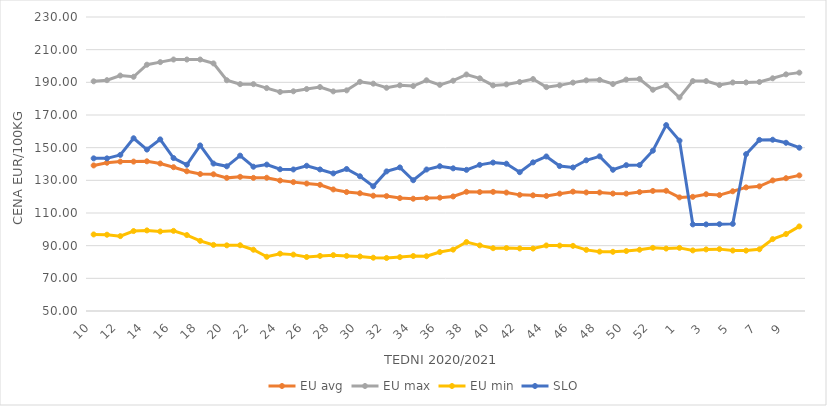
| Category | EU avg | EU max | EU min | SLO |
|---|---|---|---|---|
| 10.0 | 139.118 | 190.63 | 96.874 | 143.45 |
| 11.0 | 140.789 | 191.32 | 96.705 | 143.45 |
| 12.0 | 141.467 | 194.15 | 95.845 | 145.57 |
| 13.0 | 141.466 | 193.4 | 98.945 | 155.76 |
| 14.0 | 141.645 | 200.79 | 99.347 | 148.84 |
| 15.0 | 140.306 | 202.38 | 98.696 | 155.07 |
| 16.0 | 138.046 | 203.97 | 99.065 | 143.65 |
| 17.0 | 135.556 | 203.97 | 96.499 | 139.55 |
| 18.0 | 133.857 | 203.97 | 92.931 | 151.36 |
| 19.0 | 133.702 | 201.59 | 90.48 | 140.27 |
| 20.0 | 131.51 | 191.27 | 90.199 | 138.59 |
| 21.0 | 132.157 | 188.89 | 90.255 | 145.12 |
| 22.0 | 131.509 | 188.89 | 87.513 | 138.33 |
| 23.0 | 131.578 | 186.47 | 83.199 | 139.64 |
| 24.0 | 129.861 | 184.13 | 85.09 | 136.79 |
| 25.0 | 128.899 | 184.51 | 84.52 | 136.65 |
| 26.0 | 128.034 | 185.91 | 83.06 | 138.92 |
| 27.0 | 127.242 | 187.11 | 83.73 | 136.67 |
| 28.0 | 124.426 | 184.46 | 84.2 | 134.25 |
| 29.0 | 122.822 | 185.09 | 83.72 | 136.94 |
| 30.0 | 122.086 | 190.31 | 83.4 | 132.48 |
| 31.0 | 120.581 | 189.19 | 82.63 | 126.34 |
| 32.0 | 120.341 | 186.67 | 82.46 | 135.48 |
| 33.0 | 119.127 | 188.18 | 82.99 | 137.89 |
| 34.0 | 118.75 | 187.74 | 83.66 | 130.07 |
| 35.0 | 119.136 | 191.25 | 83.53 | 136.63 |
| 36.0 | 119.398 | 188.47 | 86.09 | 138.64 |
| 37.0 | 120.135 | 190.99 | 87.57 | 137.35 |
| 38.0 | 122.982 | 194.8 | 92.21 | 136.42 |
| 39.0 | 122.832 | 192.45 | 90.16 | 139.46 |
| 40.0 | 122.936 | 188.11 | 88.45 | 140.87 |
| 41.0 | 122.507 | 188.73 | 88.54 | 140.18 |
| 42.0 | 121.098 | 190.2 | 88.3 | 134.98 |
| 43.0 | 120.822 | 191.99 | 88.22 | 141 |
| 44.0 | 120.448 | 187.06 | 90.13 | 144.61 |
| 45.0 | 121.843 | 188.15 | 90.04 | 138.73 |
| 46.0 | 123.07 | 189.82 | 89.89 | 137.88 |
| 47.0 | 122.58 | 191.22 | 87.43 | 142.27 |
| 48.0 | 122.553 | 191.52 | 86.35 | 144.69 |
| 49.0 | 121.893 | 188.97 | 86.24 | 136.47 |
| 50.0 | 121.851 | 191.67 | 86.72 | 139.29 |
| 51.0 | 122.8 | 192.06 | 87.5 | 139.35 |
| 52.0 | 123.52 | 185.468 | 88.67 | 148.16 |
| 53.0 | 123.611 | 188.25 | 88.23 | 163.81 |
| 1.0 | 119.553 | 180.72 | 88.64 | 154.31 |
| 2.0 | 119.893 | 190.77 | 87.1 | 103.02 |
| 3.0 | 121.489 | 190.76 | 87.7 | 103.03 |
| 4.0 | 120.954 | 188.33 | 87.88 | 103.15 |
| 5.0 | 123.293 | 189.91 | 87.04 | 103.34 |
| 6.0 | 125.679 | 189.94 | 86.97 | 146.03 |
| 7.0 | 126.326 | 190.21 | 87.79 | 154.77 |
| 8.0 | 129.933 | 192.48 | 94.02 | 154.86 |
| 9.0 | 131.295 | 194.884 | 97.12 | 153 |
| 10.0 | 133.026 | 195.94 | 101.79 | 149.98 |